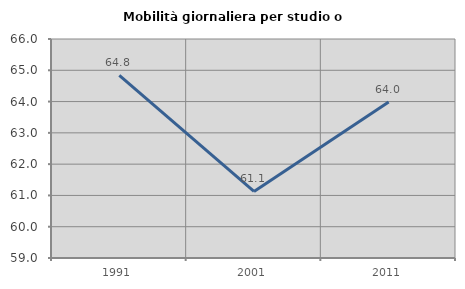
| Category | Mobilità giornaliera per studio o lavoro |
|---|---|
| 1991.0 | 64.835 |
| 2001.0 | 61.127 |
| 2011.0 | 63.99 |